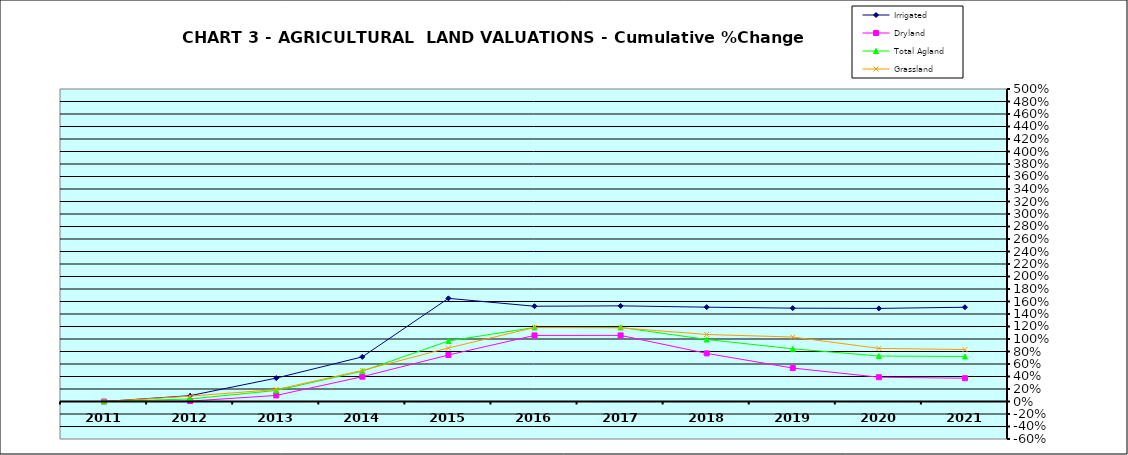
| Category | Irrigated | Dryland | Total Agland | Grassland |
|---|---|---|---|---|
| 2011.0 | 0 | 0 | 0 | 0 |
| 2012.0 | 0.094 | 0.007 | 0.041 | 0.086 |
| 2013.0 | 0.374 | 0.097 | 0.177 | 0.191 |
| 2014.0 | 0.714 | 0.397 | 0.486 | 0.496 |
| 2015.0 | 1.65 | 0.744 | 0.969 | 0.857 |
| 2016.0 | 1.524 | 1.057 | 1.185 | 1.183 |
| 2017.0 | 1.53 | 1.058 | 1.185 | 1.179 |
| 2018.0 | 1.509 | 0.77 | 0.992 | 1.072 |
| 2019.0 | 1.493 | 0.535 | 0.843 | 1.031 |
| 2020.0 | 1.489 | 0.389 | 0.727 | 0.85 |
| 2021.0 | 1.508 | 0.373 | 0.72 | 0.831 |